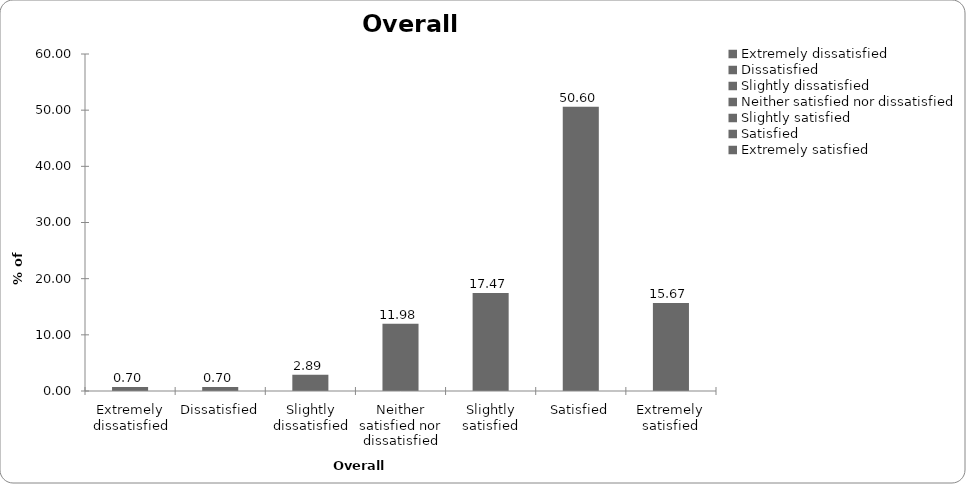
| Category | Overall satisfaction |
|---|---|
| Extremely dissatisfied | 0.699 |
| Dissatisfied | 0.699 |
| Slightly dissatisfied | 2.894 |
| Neither satisfied nor dissatisfied | 11.976 |
| Slightly satisfied | 17.465 |
| Satisfied | 50.599 |
| Extremely satisfied | 15.669 |